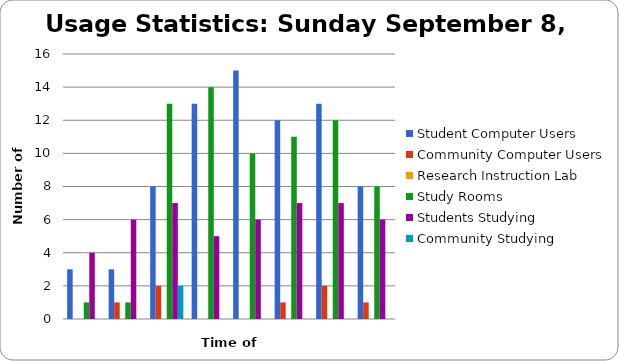
| Category | Student Computer Users | Community Computer Users | Research Instruction Lab | Study Rooms | Students Studying | Community Studying |
|---|---|---|---|---|---|---|
| 10 am | 3 | 0 | 0 | 1 | 4 | 0 |
| 11 am | 3 | 1 | 0 | 1 | 6 | 0 |
| 12 pm | 8 | 2 | 0 | 13 | 7 | 2 |
| 1 pm | 13 | 0 | 0 | 14 | 5 | 0 |
| 2 pm | 15 | 0 | 0 | 10 | 6 | 0 |
| 3 pm | 12 | 1 | 0 | 11 | 7 | 0 |
| 4 pm | 13 | 2 | 0 | 12 | 7 | 0 |
| 5 pm | 8 | 1 | 0 | 8 | 6 | 0 |